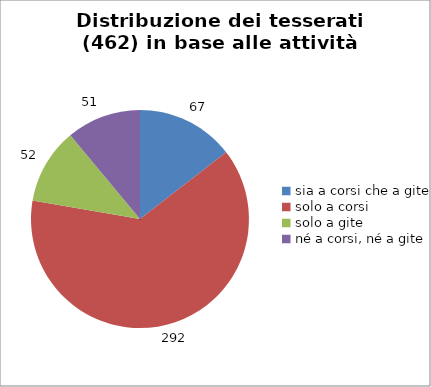
| Category | Nr. Tesserati |
|---|---|
| sia a corsi che a gite | 67 |
| solo a corsi | 292 |
| solo a gite | 52 |
| né a corsi, né a gite | 51 |